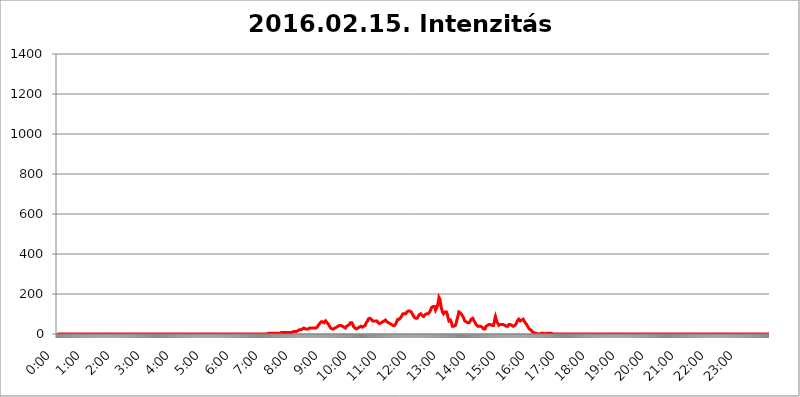
| Category | 2016.02.15. Intenzitás [W/m^2] |
|---|---|
| 0.0 | 0 |
| 0.0006944444444444445 | 0 |
| 0.001388888888888889 | 0 |
| 0.0020833333333333333 | 0 |
| 0.002777777777777778 | 0 |
| 0.003472222222222222 | 0 |
| 0.004166666666666667 | 0 |
| 0.004861111111111111 | 0 |
| 0.005555555555555556 | 0 |
| 0.0062499999999999995 | 0 |
| 0.006944444444444444 | 0 |
| 0.007638888888888889 | 0 |
| 0.008333333333333333 | 0 |
| 0.009027777777777779 | 0 |
| 0.009722222222222222 | 0 |
| 0.010416666666666666 | 0 |
| 0.011111111111111112 | 0 |
| 0.011805555555555555 | 0 |
| 0.012499999999999999 | 0 |
| 0.013194444444444444 | 0 |
| 0.013888888888888888 | 0 |
| 0.014583333333333332 | 0 |
| 0.015277777777777777 | 0 |
| 0.015972222222222224 | 0 |
| 0.016666666666666666 | 0 |
| 0.017361111111111112 | 0 |
| 0.018055555555555557 | 0 |
| 0.01875 | 0 |
| 0.019444444444444445 | 0 |
| 0.02013888888888889 | 0 |
| 0.020833333333333332 | 0 |
| 0.02152777777777778 | 0 |
| 0.022222222222222223 | 0 |
| 0.02291666666666667 | 0 |
| 0.02361111111111111 | 0 |
| 0.024305555555555556 | 0 |
| 0.024999999999999998 | 0 |
| 0.025694444444444447 | 0 |
| 0.02638888888888889 | 0 |
| 0.027083333333333334 | 0 |
| 0.027777777777777776 | 0 |
| 0.02847222222222222 | 0 |
| 0.029166666666666664 | 0 |
| 0.029861111111111113 | 0 |
| 0.030555555555555555 | 0 |
| 0.03125 | 0 |
| 0.03194444444444445 | 0 |
| 0.03263888888888889 | 0 |
| 0.03333333333333333 | 0 |
| 0.034027777777777775 | 0 |
| 0.034722222222222224 | 0 |
| 0.035416666666666666 | 0 |
| 0.036111111111111115 | 0 |
| 0.03680555555555556 | 0 |
| 0.0375 | 0 |
| 0.03819444444444444 | 0 |
| 0.03888888888888889 | 0 |
| 0.03958333333333333 | 0 |
| 0.04027777777777778 | 0 |
| 0.04097222222222222 | 0 |
| 0.041666666666666664 | 0 |
| 0.042361111111111106 | 0 |
| 0.04305555555555556 | 0 |
| 0.043750000000000004 | 0 |
| 0.044444444444444446 | 0 |
| 0.04513888888888889 | 0 |
| 0.04583333333333334 | 0 |
| 0.04652777777777778 | 0 |
| 0.04722222222222222 | 0 |
| 0.04791666666666666 | 0 |
| 0.04861111111111111 | 0 |
| 0.049305555555555554 | 0 |
| 0.049999999999999996 | 0 |
| 0.05069444444444445 | 0 |
| 0.051388888888888894 | 0 |
| 0.052083333333333336 | 0 |
| 0.05277777777777778 | 0 |
| 0.05347222222222222 | 0 |
| 0.05416666666666667 | 0 |
| 0.05486111111111111 | 0 |
| 0.05555555555555555 | 0 |
| 0.05625 | 0 |
| 0.05694444444444444 | 0 |
| 0.057638888888888885 | 0 |
| 0.05833333333333333 | 0 |
| 0.05902777777777778 | 0 |
| 0.059722222222222225 | 0 |
| 0.06041666666666667 | 0 |
| 0.061111111111111116 | 0 |
| 0.06180555555555556 | 0 |
| 0.0625 | 0 |
| 0.06319444444444444 | 0 |
| 0.06388888888888888 | 0 |
| 0.06458333333333334 | 0 |
| 0.06527777777777778 | 0 |
| 0.06597222222222222 | 0 |
| 0.06666666666666667 | 0 |
| 0.06736111111111111 | 0 |
| 0.06805555555555555 | 0 |
| 0.06874999999999999 | 0 |
| 0.06944444444444443 | 0 |
| 0.07013888888888889 | 0 |
| 0.07083333333333333 | 0 |
| 0.07152777777777779 | 0 |
| 0.07222222222222223 | 0 |
| 0.07291666666666667 | 0 |
| 0.07361111111111111 | 0 |
| 0.07430555555555556 | 0 |
| 0.075 | 0 |
| 0.07569444444444444 | 0 |
| 0.0763888888888889 | 0 |
| 0.07708333333333334 | 0 |
| 0.07777777777777778 | 0 |
| 0.07847222222222222 | 0 |
| 0.07916666666666666 | 0 |
| 0.0798611111111111 | 0 |
| 0.08055555555555556 | 0 |
| 0.08125 | 0 |
| 0.08194444444444444 | 0 |
| 0.08263888888888889 | 0 |
| 0.08333333333333333 | 0 |
| 0.08402777777777777 | 0 |
| 0.08472222222222221 | 0 |
| 0.08541666666666665 | 0 |
| 0.08611111111111112 | 0 |
| 0.08680555555555557 | 0 |
| 0.08750000000000001 | 0 |
| 0.08819444444444445 | 0 |
| 0.08888888888888889 | 0 |
| 0.08958333333333333 | 0 |
| 0.09027777777777778 | 0 |
| 0.09097222222222222 | 0 |
| 0.09166666666666667 | 0 |
| 0.09236111111111112 | 0 |
| 0.09305555555555556 | 0 |
| 0.09375 | 0 |
| 0.09444444444444444 | 0 |
| 0.09513888888888888 | 0 |
| 0.09583333333333333 | 0 |
| 0.09652777777777777 | 0 |
| 0.09722222222222222 | 0 |
| 0.09791666666666667 | 0 |
| 0.09861111111111111 | 0 |
| 0.09930555555555555 | 0 |
| 0.09999999999999999 | 0 |
| 0.10069444444444443 | 0 |
| 0.1013888888888889 | 0 |
| 0.10208333333333335 | 0 |
| 0.10277777777777779 | 0 |
| 0.10347222222222223 | 0 |
| 0.10416666666666667 | 0 |
| 0.10486111111111111 | 0 |
| 0.10555555555555556 | 0 |
| 0.10625 | 0 |
| 0.10694444444444444 | 0 |
| 0.1076388888888889 | 0 |
| 0.10833333333333334 | 0 |
| 0.10902777777777778 | 0 |
| 0.10972222222222222 | 0 |
| 0.1111111111111111 | 0 |
| 0.11180555555555556 | 0 |
| 0.11180555555555556 | 0 |
| 0.1125 | 0 |
| 0.11319444444444444 | 0 |
| 0.11388888888888889 | 0 |
| 0.11458333333333333 | 0 |
| 0.11527777777777777 | 0 |
| 0.11597222222222221 | 0 |
| 0.11666666666666665 | 0 |
| 0.1173611111111111 | 0 |
| 0.11805555555555557 | 0 |
| 0.11944444444444445 | 0 |
| 0.12013888888888889 | 0 |
| 0.12083333333333333 | 0 |
| 0.12152777777777778 | 0 |
| 0.12222222222222223 | 0 |
| 0.12291666666666667 | 0 |
| 0.12291666666666667 | 0 |
| 0.12361111111111112 | 0 |
| 0.12430555555555556 | 0 |
| 0.125 | 0 |
| 0.12569444444444444 | 0 |
| 0.12638888888888888 | 0 |
| 0.12708333333333333 | 0 |
| 0.16875 | 0 |
| 0.12847222222222224 | 0 |
| 0.12916666666666668 | 0 |
| 0.12986111111111112 | 0 |
| 0.13055555555555556 | 0 |
| 0.13125 | 0 |
| 0.13194444444444445 | 0 |
| 0.1326388888888889 | 0 |
| 0.13333333333333333 | 0 |
| 0.13402777777777777 | 0 |
| 0.13402777777777777 | 0 |
| 0.13472222222222222 | 0 |
| 0.13541666666666666 | 0 |
| 0.1361111111111111 | 0 |
| 0.13749999999999998 | 0 |
| 0.13819444444444443 | 0 |
| 0.1388888888888889 | 0 |
| 0.13958333333333334 | 0 |
| 0.14027777777777778 | 0 |
| 0.14097222222222222 | 0 |
| 0.14166666666666666 | 0 |
| 0.1423611111111111 | 0 |
| 0.14305555555555557 | 0 |
| 0.14375000000000002 | 0 |
| 0.14444444444444446 | 0 |
| 0.1451388888888889 | 0 |
| 0.1451388888888889 | 0 |
| 0.14652777777777778 | 0 |
| 0.14722222222222223 | 0 |
| 0.14791666666666667 | 0 |
| 0.1486111111111111 | 0 |
| 0.14930555555555555 | 0 |
| 0.15 | 0 |
| 0.15069444444444444 | 0 |
| 0.15138888888888888 | 0 |
| 0.15208333333333332 | 0 |
| 0.15277777777777776 | 0 |
| 0.15347222222222223 | 0 |
| 0.15416666666666667 | 0 |
| 0.15486111111111112 | 0 |
| 0.15555555555555556 | 0 |
| 0.15625 | 0 |
| 0.15694444444444444 | 0 |
| 0.15763888888888888 | 0 |
| 0.15833333333333333 | 0 |
| 0.15902777777777777 | 0 |
| 0.15972222222222224 | 0 |
| 0.16041666666666668 | 0 |
| 0.16111111111111112 | 0 |
| 0.16180555555555556 | 0 |
| 0.1625 | 0 |
| 0.16319444444444445 | 0 |
| 0.1638888888888889 | 0 |
| 0.16458333333333333 | 0 |
| 0.16527777777777777 | 0 |
| 0.16597222222222222 | 0 |
| 0.16666666666666666 | 0 |
| 0.1673611111111111 | 0 |
| 0.16805555555555554 | 0 |
| 0.16874999999999998 | 0 |
| 0.16944444444444443 | 0 |
| 0.17013888888888887 | 0 |
| 0.1708333333333333 | 0 |
| 0.17152777777777775 | 0 |
| 0.17222222222222225 | 0 |
| 0.1729166666666667 | 0 |
| 0.17361111111111113 | 0 |
| 0.17430555555555557 | 0 |
| 0.17500000000000002 | 0 |
| 0.17569444444444446 | 0 |
| 0.1763888888888889 | 0 |
| 0.17708333333333334 | 0 |
| 0.17777777777777778 | 0 |
| 0.17847222222222223 | 0 |
| 0.17916666666666667 | 0 |
| 0.1798611111111111 | 0 |
| 0.18055555555555555 | 0 |
| 0.18125 | 0 |
| 0.18194444444444444 | 0 |
| 0.1826388888888889 | 0 |
| 0.18333333333333335 | 0 |
| 0.1840277777777778 | 0 |
| 0.18472222222222223 | 0 |
| 0.18541666666666667 | 0 |
| 0.18611111111111112 | 0 |
| 0.18680555555555556 | 0 |
| 0.1875 | 0 |
| 0.18819444444444444 | 0 |
| 0.18888888888888888 | 0 |
| 0.18958333333333333 | 0 |
| 0.19027777777777777 | 0 |
| 0.1909722222222222 | 0 |
| 0.19166666666666665 | 0 |
| 0.19236111111111112 | 0 |
| 0.19305555555555554 | 0 |
| 0.19375 | 0 |
| 0.19444444444444445 | 0 |
| 0.1951388888888889 | 0 |
| 0.19583333333333333 | 0 |
| 0.19652777777777777 | 0 |
| 0.19722222222222222 | 0 |
| 0.19791666666666666 | 0 |
| 0.1986111111111111 | 0 |
| 0.19930555555555554 | 0 |
| 0.19999999999999998 | 0 |
| 0.20069444444444443 | 0 |
| 0.20138888888888887 | 0 |
| 0.2020833333333333 | 0 |
| 0.2027777777777778 | 0 |
| 0.2034722222222222 | 0 |
| 0.2041666666666667 | 0 |
| 0.20486111111111113 | 0 |
| 0.20555555555555557 | 0 |
| 0.20625000000000002 | 0 |
| 0.20694444444444446 | 0 |
| 0.2076388888888889 | 0 |
| 0.20833333333333334 | 0 |
| 0.20902777777777778 | 0 |
| 0.20972222222222223 | 0 |
| 0.21041666666666667 | 0 |
| 0.2111111111111111 | 0 |
| 0.21180555555555555 | 0 |
| 0.2125 | 0 |
| 0.21319444444444444 | 0 |
| 0.2138888888888889 | 0 |
| 0.21458333333333335 | 0 |
| 0.2152777777777778 | 0 |
| 0.21597222222222223 | 0 |
| 0.21666666666666667 | 0 |
| 0.21736111111111112 | 0 |
| 0.21805555555555556 | 0 |
| 0.21875 | 0 |
| 0.21944444444444444 | 0 |
| 0.22013888888888888 | 0 |
| 0.22083333333333333 | 0 |
| 0.22152777777777777 | 0 |
| 0.2222222222222222 | 0 |
| 0.22291666666666665 | 0 |
| 0.2236111111111111 | 0 |
| 0.22430555555555556 | 0 |
| 0.225 | 0 |
| 0.22569444444444445 | 0 |
| 0.2263888888888889 | 0 |
| 0.22708333333333333 | 0 |
| 0.22777777777777777 | 0 |
| 0.22847222222222222 | 0 |
| 0.22916666666666666 | 0 |
| 0.2298611111111111 | 0 |
| 0.23055555555555554 | 0 |
| 0.23124999999999998 | 0 |
| 0.23194444444444443 | 0 |
| 0.23263888888888887 | 0 |
| 0.2333333333333333 | 0 |
| 0.2340277777777778 | 0 |
| 0.2347222222222222 | 0 |
| 0.2354166666666667 | 0 |
| 0.23611111111111113 | 0 |
| 0.23680555555555557 | 0 |
| 0.23750000000000002 | 0 |
| 0.23819444444444446 | 0 |
| 0.2388888888888889 | 0 |
| 0.23958333333333334 | 0 |
| 0.24027777777777778 | 0 |
| 0.24097222222222223 | 0 |
| 0.24166666666666667 | 0 |
| 0.2423611111111111 | 0 |
| 0.24305555555555555 | 0 |
| 0.24375 | 0 |
| 0.24444444444444446 | 0 |
| 0.24513888888888888 | 0 |
| 0.24583333333333335 | 0 |
| 0.2465277777777778 | 0 |
| 0.24722222222222223 | 0 |
| 0.24791666666666667 | 0 |
| 0.24861111111111112 | 0 |
| 0.24930555555555556 | 0 |
| 0.25 | 0 |
| 0.25069444444444444 | 0 |
| 0.2513888888888889 | 0 |
| 0.2520833333333333 | 0 |
| 0.25277777777777777 | 0 |
| 0.2534722222222222 | 0 |
| 0.25416666666666665 | 0 |
| 0.2548611111111111 | 0 |
| 0.2555555555555556 | 0 |
| 0.25625000000000003 | 0 |
| 0.2569444444444445 | 0 |
| 0.2576388888888889 | 0 |
| 0.25833333333333336 | 0 |
| 0.2590277777777778 | 0 |
| 0.25972222222222224 | 0 |
| 0.2604166666666667 | 0 |
| 0.2611111111111111 | 0 |
| 0.26180555555555557 | 0 |
| 0.2625 | 0 |
| 0.26319444444444445 | 0 |
| 0.2638888888888889 | 0 |
| 0.26458333333333334 | 0 |
| 0.2652777777777778 | 0 |
| 0.2659722222222222 | 0 |
| 0.26666666666666666 | 0 |
| 0.2673611111111111 | 0 |
| 0.26805555555555555 | 0 |
| 0.26875 | 0 |
| 0.26944444444444443 | 0 |
| 0.2701388888888889 | 0 |
| 0.2708333333333333 | 0 |
| 0.27152777777777776 | 0 |
| 0.2722222222222222 | 0 |
| 0.27291666666666664 | 0 |
| 0.2736111111111111 | 0 |
| 0.2743055555555555 | 0 |
| 0.27499999999999997 | 0 |
| 0.27569444444444446 | 0 |
| 0.27638888888888885 | 0 |
| 0.27708333333333335 | 0 |
| 0.2777777777777778 | 0 |
| 0.27847222222222223 | 0 |
| 0.2791666666666667 | 0 |
| 0.2798611111111111 | 0 |
| 0.28055555555555556 | 0 |
| 0.28125 | 0 |
| 0.28194444444444444 | 0 |
| 0.2826388888888889 | 0 |
| 0.2833333333333333 | 0 |
| 0.28402777777777777 | 0 |
| 0.2847222222222222 | 0 |
| 0.28541666666666665 | 0 |
| 0.28611111111111115 | 0 |
| 0.28680555555555554 | 0 |
| 0.28750000000000003 | 0 |
| 0.2881944444444445 | 0 |
| 0.2888888888888889 | 0 |
| 0.28958333333333336 | 0 |
| 0.2902777777777778 | 0 |
| 0.29097222222222224 | 0 |
| 0.2916666666666667 | 0 |
| 0.2923611111111111 | 0 |
| 0.29305555555555557 | 0 |
| 0.29375 | 0 |
| 0.29444444444444445 | 3.525 |
| 0.2951388888888889 | 3.525 |
| 0.29583333333333334 | 3.525 |
| 0.2965277777777778 | 3.525 |
| 0.2972222222222222 | 3.525 |
| 0.29791666666666666 | 3.525 |
| 0.2986111111111111 | 3.525 |
| 0.29930555555555555 | 3.525 |
| 0.3 | 3.525 |
| 0.30069444444444443 | 3.525 |
| 0.3013888888888889 | 3.525 |
| 0.3020833333333333 | 3.525 |
| 0.30277777777777776 | 3.525 |
| 0.3034722222222222 | 3.525 |
| 0.30416666666666664 | 3.525 |
| 0.3048611111111111 | 3.525 |
| 0.3055555555555555 | 3.525 |
| 0.30624999999999997 | 3.525 |
| 0.3069444444444444 | 3.525 |
| 0.3076388888888889 | 3.525 |
| 0.30833333333333335 | 3.525 |
| 0.3090277777777778 | 3.525 |
| 0.30972222222222223 | 3.525 |
| 0.3104166666666667 | 3.525 |
| 0.3111111111111111 | 3.525 |
| 0.31180555555555556 | 3.525 |
| 0.3125 | 3.525 |
| 0.31319444444444444 | 7.887 |
| 0.3138888888888889 | 7.887 |
| 0.3145833333333333 | 7.887 |
| 0.31527777777777777 | 7.887 |
| 0.3159722222222222 | 7.887 |
| 0.31666666666666665 | 7.887 |
| 0.31736111111111115 | 7.887 |
| 0.31805555555555554 | 7.887 |
| 0.31875000000000003 | 7.887 |
| 0.3194444444444445 | 7.887 |
| 0.3201388888888889 | 7.887 |
| 0.32083333333333336 | 7.887 |
| 0.3215277777777778 | 7.887 |
| 0.32222222222222224 | 7.887 |
| 0.3229166666666667 | 7.887 |
| 0.3236111111111111 | 7.887 |
| 0.32430555555555557 | 7.887 |
| 0.325 | 7.887 |
| 0.32569444444444445 | 7.887 |
| 0.3263888888888889 | 7.887 |
| 0.32708333333333334 | 7.887 |
| 0.3277777777777778 | 7.887 |
| 0.3284722222222222 | 7.887 |
| 0.32916666666666666 | 7.887 |
| 0.3298611111111111 | 7.887 |
| 0.33055555555555555 | 7.887 |
| 0.33125 | 12.257 |
| 0.33194444444444443 | 12.257 |
| 0.3326388888888889 | 12.257 |
| 0.3333333333333333 | 12.257 |
| 0.3340277777777778 | 12.257 |
| 0.3347222222222222 | 12.257 |
| 0.3354166666666667 | 12.257 |
| 0.3361111111111111 | 12.257 |
| 0.3368055555555556 | 16.636 |
| 0.33749999999999997 | 16.636 |
| 0.33819444444444446 | 16.636 |
| 0.33888888888888885 | 16.636 |
| 0.33958333333333335 | 21.024 |
| 0.34027777777777773 | 21.024 |
| 0.34097222222222223 | 21.024 |
| 0.3416666666666666 | 21.024 |
| 0.3423611111111111 | 25.419 |
| 0.3430555555555555 | 25.419 |
| 0.34375 | 25.419 |
| 0.3444444444444445 | 29.823 |
| 0.3451388888888889 | 25.419 |
| 0.3458333333333334 | 29.823 |
| 0.34652777777777777 | 29.823 |
| 0.34722222222222227 | 29.823 |
| 0.34791666666666665 | 25.419 |
| 0.34861111111111115 | 25.419 |
| 0.34930555555555554 | 25.419 |
| 0.35000000000000003 | 25.419 |
| 0.3506944444444444 | 25.419 |
| 0.3513888888888889 | 25.419 |
| 0.3520833333333333 | 25.419 |
| 0.3527777777777778 | 25.419 |
| 0.3534722222222222 | 29.823 |
| 0.3541666666666667 | 29.823 |
| 0.3548611111111111 | 29.823 |
| 0.35555555555555557 | 29.823 |
| 0.35625 | 29.823 |
| 0.35694444444444445 | 29.823 |
| 0.3576388888888889 | 29.823 |
| 0.35833333333333334 | 29.823 |
| 0.3590277777777778 | 29.823 |
| 0.3597222222222222 | 29.823 |
| 0.36041666666666666 | 29.823 |
| 0.3611111111111111 | 29.823 |
| 0.36180555555555555 | 29.823 |
| 0.3625 | 29.823 |
| 0.36319444444444443 | 29.823 |
| 0.3638888888888889 | 34.234 |
| 0.3645833333333333 | 34.234 |
| 0.3652777777777778 | 38.653 |
| 0.3659722222222222 | 43.079 |
| 0.3666666666666667 | 47.511 |
| 0.3673611111111111 | 47.511 |
| 0.3680555555555556 | 51.951 |
| 0.36874999999999997 | 56.398 |
| 0.36944444444444446 | 56.398 |
| 0.37013888888888885 | 60.85 |
| 0.37083333333333335 | 60.85 |
| 0.37152777777777773 | 65.31 |
| 0.37222222222222223 | 60.85 |
| 0.3729166666666666 | 60.85 |
| 0.3736111111111111 | 56.398 |
| 0.3743055555555555 | 56.398 |
| 0.375 | 56.398 |
| 0.3756944444444445 | 60.85 |
| 0.3763888888888889 | 65.31 |
| 0.3770833333333334 | 60.85 |
| 0.37777777777777777 | 60.85 |
| 0.37847222222222227 | 56.398 |
| 0.37916666666666665 | 56.398 |
| 0.37986111111111115 | 51.951 |
| 0.38055555555555554 | 47.511 |
| 0.38125000000000003 | 43.079 |
| 0.3819444444444444 | 38.653 |
| 0.3826388888888889 | 34.234 |
| 0.3833333333333333 | 29.823 |
| 0.3840277777777778 | 29.823 |
| 0.3847222222222222 | 25.419 |
| 0.3854166666666667 | 25.419 |
| 0.3861111111111111 | 25.419 |
| 0.38680555555555557 | 29.823 |
| 0.3875 | 25.419 |
| 0.38819444444444445 | 29.823 |
| 0.3888888888888889 | 29.823 |
| 0.38958333333333334 | 29.823 |
| 0.3902777777777778 | 34.234 |
| 0.3909722222222222 | 34.234 |
| 0.39166666666666666 | 34.234 |
| 0.3923611111111111 | 34.234 |
| 0.39305555555555555 | 34.234 |
| 0.39375 | 38.653 |
| 0.39444444444444443 | 38.653 |
| 0.3951388888888889 | 43.079 |
| 0.3958333333333333 | 43.079 |
| 0.3965277777777778 | 43.079 |
| 0.3972222222222222 | 43.079 |
| 0.3979166666666667 | 43.079 |
| 0.3986111111111111 | 47.511 |
| 0.3993055555555556 | 43.079 |
| 0.39999999999999997 | 38.653 |
| 0.40069444444444446 | 38.653 |
| 0.40138888888888885 | 34.234 |
| 0.40208333333333335 | 34.234 |
| 0.40277777777777773 | 29.823 |
| 0.40347222222222223 | 29.823 |
| 0.4041666666666666 | 29.823 |
| 0.4048611111111111 | 34.234 |
| 0.4055555555555555 | 38.653 |
| 0.40625 | 38.653 |
| 0.4069444444444445 | 38.653 |
| 0.4076388888888889 | 43.079 |
| 0.4083333333333334 | 47.511 |
| 0.40902777777777777 | 47.511 |
| 0.40972222222222227 | 47.511 |
| 0.41041666666666665 | 51.951 |
| 0.41111111111111115 | 56.398 |
| 0.41180555555555554 | 56.398 |
| 0.41250000000000003 | 56.398 |
| 0.4131944444444444 | 56.398 |
| 0.4138888888888889 | 51.951 |
| 0.4145833333333333 | 47.511 |
| 0.4152777777777778 | 38.653 |
| 0.4159722222222222 | 34.234 |
| 0.4166666666666667 | 34.234 |
| 0.4173611111111111 | 29.823 |
| 0.41805555555555557 | 29.823 |
| 0.41875 | 29.823 |
| 0.41944444444444445 | 25.419 |
| 0.4201388888888889 | 25.419 |
| 0.42083333333333334 | 25.419 |
| 0.4215277777777778 | 29.823 |
| 0.4222222222222222 | 29.823 |
| 0.42291666666666666 | 29.823 |
| 0.4236111111111111 | 34.234 |
| 0.42430555555555555 | 34.234 |
| 0.425 | 38.653 |
| 0.42569444444444443 | 38.653 |
| 0.4263888888888889 | 38.653 |
| 0.4270833333333333 | 34.234 |
| 0.4277777777777778 | 34.234 |
| 0.4284722222222222 | 34.234 |
| 0.4291666666666667 | 34.234 |
| 0.4298611111111111 | 38.653 |
| 0.4305555555555556 | 38.653 |
| 0.43124999999999997 | 38.653 |
| 0.43194444444444446 | 43.079 |
| 0.43263888888888885 | 47.511 |
| 0.43333333333333335 | 56.398 |
| 0.43402777777777773 | 60.85 |
| 0.43472222222222223 | 60.85 |
| 0.4354166666666666 | 65.31 |
| 0.4361111111111111 | 74.246 |
| 0.4368055555555555 | 78.722 |
| 0.4375 | 78.722 |
| 0.4381944444444445 | 78.722 |
| 0.4388888888888889 | 74.246 |
| 0.4395833333333334 | 74.246 |
| 0.44027777777777777 | 74.246 |
| 0.44097222222222227 | 74.246 |
| 0.44166666666666665 | 69.775 |
| 0.44236111111111115 | 65.31 |
| 0.44305555555555554 | 65.31 |
| 0.44375000000000003 | 60.85 |
| 0.4444444444444444 | 65.31 |
| 0.4451388888888889 | 65.31 |
| 0.4458333333333333 | 65.31 |
| 0.4465277777777778 | 65.31 |
| 0.4472222222222222 | 65.31 |
| 0.4479166666666667 | 65.31 |
| 0.4486111111111111 | 65.31 |
| 0.44930555555555557 | 60.85 |
| 0.45 | 56.398 |
| 0.45069444444444445 | 56.398 |
| 0.4513888888888889 | 56.398 |
| 0.45208333333333334 | 51.951 |
| 0.4527777777777778 | 56.398 |
| 0.4534722222222222 | 56.398 |
| 0.45416666666666666 | 56.398 |
| 0.4548611111111111 | 56.398 |
| 0.45555555555555555 | 56.398 |
| 0.45625 | 60.85 |
| 0.45694444444444443 | 60.85 |
| 0.4576388888888889 | 65.31 |
| 0.4583333333333333 | 65.31 |
| 0.4590277777777778 | 69.775 |
| 0.4597222222222222 | 69.775 |
| 0.4604166666666667 | 69.775 |
| 0.4611111111111111 | 65.31 |
| 0.4618055555555556 | 65.31 |
| 0.46249999999999997 | 60.85 |
| 0.46319444444444446 | 56.398 |
| 0.46388888888888885 | 56.398 |
| 0.46458333333333335 | 56.398 |
| 0.46527777777777773 | 51.951 |
| 0.46597222222222223 | 51.951 |
| 0.4666666666666666 | 51.951 |
| 0.4673611111111111 | 51.951 |
| 0.4680555555555555 | 51.951 |
| 0.46875 | 47.511 |
| 0.4694444444444445 | 47.511 |
| 0.4701388888888889 | 47.511 |
| 0.4708333333333334 | 43.079 |
| 0.47152777777777777 | 43.079 |
| 0.47222222222222227 | 43.079 |
| 0.47291666666666665 | 43.079 |
| 0.47361111111111115 | 47.511 |
| 0.47430555555555554 | 47.511 |
| 0.47500000000000003 | 51.951 |
| 0.4756944444444444 | 56.398 |
| 0.4763888888888889 | 65.31 |
| 0.4770833333333333 | 69.775 |
| 0.4777777777777778 | 74.246 |
| 0.4784722222222222 | 74.246 |
| 0.4791666666666667 | 74.246 |
| 0.4798611111111111 | 74.246 |
| 0.48055555555555557 | 74.246 |
| 0.48125 | 78.722 |
| 0.48194444444444445 | 83.205 |
| 0.4826388888888889 | 87.692 |
| 0.48333333333333334 | 92.184 |
| 0.4840277777777778 | 96.682 |
| 0.4847222222222222 | 101.184 |
| 0.48541666666666666 | 101.184 |
| 0.4861111111111111 | 101.184 |
| 0.48680555555555555 | 101.184 |
| 0.4875 | 101.184 |
| 0.48819444444444443 | 101.184 |
| 0.4888888888888889 | 101.184 |
| 0.4895833333333333 | 105.69 |
| 0.4902777777777778 | 110.201 |
| 0.4909722222222222 | 110.201 |
| 0.4916666666666667 | 114.716 |
| 0.4923611111111111 | 114.716 |
| 0.4930555555555556 | 119.235 |
| 0.49374999999999997 | 114.716 |
| 0.49444444444444446 | 114.716 |
| 0.49513888888888885 | 114.716 |
| 0.49583333333333335 | 110.201 |
| 0.49652777777777773 | 110.201 |
| 0.49722222222222223 | 105.69 |
| 0.4979166666666666 | 101.184 |
| 0.4986111111111111 | 101.184 |
| 0.4993055555555555 | 92.184 |
| 0.5 | 87.692 |
| 0.5006944444444444 | 83.205 |
| 0.5013888888888889 | 83.205 |
| 0.5020833333333333 | 78.722 |
| 0.5027777777777778 | 78.722 |
| 0.5034722222222222 | 74.246 |
| 0.5041666666666667 | 78.722 |
| 0.5048611111111111 | 78.722 |
| 0.5055555555555555 | 83.205 |
| 0.50625 | 87.692 |
| 0.5069444444444444 | 92.184 |
| 0.5076388888888889 | 96.682 |
| 0.5083333333333333 | 96.682 |
| 0.5090277777777777 | 101.184 |
| 0.5097222222222222 | 101.184 |
| 0.5104166666666666 | 96.682 |
| 0.5111111111111112 | 96.682 |
| 0.5118055555555555 | 92.184 |
| 0.5125000000000001 | 87.692 |
| 0.5131944444444444 | 87.692 |
| 0.513888888888889 | 87.692 |
| 0.5145833333333333 | 87.692 |
| 0.5152777777777778 | 92.184 |
| 0.5159722222222222 | 96.682 |
| 0.5166666666666667 | 96.682 |
| 0.517361111111111 | 101.184 |
| 0.5180555555555556 | 101.184 |
| 0.5187499999999999 | 101.184 |
| 0.5194444444444445 | 101.184 |
| 0.5201388888888888 | 101.184 |
| 0.5208333333333334 | 101.184 |
| 0.5215277777777778 | 105.69 |
| 0.5222222222222223 | 110.201 |
| 0.5229166666666667 | 114.716 |
| 0.5236111111111111 | 119.235 |
| 0.5243055555555556 | 119.235 |
| 0.525 | 132.814 |
| 0.5256944444444445 | 137.347 |
| 0.5263888888888889 | 137.347 |
| 0.5270833333333333 | 137.347 |
| 0.5277777777777778 | 137.347 |
| 0.5284722222222222 | 132.814 |
| 0.5291666666666667 | 137.347 |
| 0.5298611111111111 | 128.284 |
| 0.5305555555555556 | 119.235 |
| 0.53125 | 123.758 |
| 0.5319444444444444 | 128.284 |
| 0.5326388888888889 | 132.814 |
| 0.5333333333333333 | 141.884 |
| 0.5340277777777778 | 155.509 |
| 0.5347222222222222 | 164.605 |
| 0.5354166666666667 | 182.82 |
| 0.5361111111111111 | 187.378 |
| 0.5368055555555555 | 173.709 |
| 0.5375 | 155.509 |
| 0.5381944444444444 | 137.347 |
| 0.5388888888888889 | 128.284 |
| 0.5395833333333333 | 119.235 |
| 0.5402777777777777 | 110.201 |
| 0.5409722222222222 | 110.201 |
| 0.5416666666666666 | 101.184 |
| 0.5423611111111112 | 101.184 |
| 0.5430555555555555 | 105.69 |
| 0.5437500000000001 | 110.201 |
| 0.5444444444444444 | 114.716 |
| 0.545138888888889 | 114.716 |
| 0.5458333333333333 | 110.201 |
| 0.5465277777777778 | 110.201 |
| 0.5472222222222222 | 96.682 |
| 0.5479166666666667 | 83.205 |
| 0.548611111111111 | 74.246 |
| 0.5493055555555556 | 65.31 |
| 0.5499999999999999 | 65.31 |
| 0.5506944444444445 | 65.31 |
| 0.5513888888888888 | 69.775 |
| 0.5520833333333334 | 65.31 |
| 0.5527777777777778 | 56.398 |
| 0.5534722222222223 | 47.511 |
| 0.5541666666666667 | 38.653 |
| 0.5548611111111111 | 38.653 |
| 0.5555555555555556 | 38.653 |
| 0.55625 | 38.653 |
| 0.5569444444444445 | 38.653 |
| 0.5576388888888889 | 38.653 |
| 0.5583333333333333 | 43.079 |
| 0.5590277777777778 | 47.511 |
| 0.5597222222222222 | 56.398 |
| 0.5604166666666667 | 69.775 |
| 0.5611111111111111 | 74.246 |
| 0.5618055555555556 | 87.692 |
| 0.5625 | 96.682 |
| 0.5631944444444444 | 110.201 |
| 0.5638888888888889 | 105.69 |
| 0.5645833333333333 | 105.69 |
| 0.5652777777777778 | 105.69 |
| 0.5659722222222222 | 101.184 |
| 0.5666666666666667 | 101.184 |
| 0.5673611111111111 | 96.682 |
| 0.5680555555555555 | 92.184 |
| 0.56875 | 87.692 |
| 0.5694444444444444 | 83.205 |
| 0.5701388888888889 | 78.722 |
| 0.5708333333333333 | 74.246 |
| 0.5715277777777777 | 65.31 |
| 0.5722222222222222 | 65.31 |
| 0.5729166666666666 | 65.31 |
| 0.5736111111111112 | 60.85 |
| 0.5743055555555555 | 60.85 |
| 0.5750000000000001 | 60.85 |
| 0.5756944444444444 | 56.398 |
| 0.576388888888889 | 56.398 |
| 0.5770833333333333 | 56.398 |
| 0.5777777777777778 | 56.398 |
| 0.5784722222222222 | 56.398 |
| 0.5791666666666667 | 65.31 |
| 0.579861111111111 | 65.31 |
| 0.5805555555555556 | 74.246 |
| 0.5812499999999999 | 74.246 |
| 0.5819444444444445 | 78.722 |
| 0.5826388888888888 | 78.722 |
| 0.5833333333333334 | 74.246 |
| 0.5840277777777778 | 69.775 |
| 0.5847222222222223 | 69.775 |
| 0.5854166666666667 | 65.31 |
| 0.5861111111111111 | 56.398 |
| 0.5868055555555556 | 51.951 |
| 0.5875 | 47.511 |
| 0.5881944444444445 | 43.079 |
| 0.5888888888888889 | 43.079 |
| 0.5895833333333333 | 38.653 |
| 0.5902777777777778 | 38.653 |
| 0.5909722222222222 | 38.653 |
| 0.5916666666666667 | 38.653 |
| 0.5923611111111111 | 38.653 |
| 0.5930555555555556 | 38.653 |
| 0.59375 | 38.653 |
| 0.5944444444444444 | 38.653 |
| 0.5951388888888889 | 38.653 |
| 0.5958333333333333 | 34.234 |
| 0.5965277777777778 | 29.823 |
| 0.5972222222222222 | 29.823 |
| 0.5979166666666667 | 25.419 |
| 0.5986111111111111 | 25.419 |
| 0.5993055555555555 | 25.419 |
| 0.6 | 25.419 |
| 0.6006944444444444 | 29.823 |
| 0.6013888888888889 | 38.653 |
| 0.6020833333333333 | 43.079 |
| 0.6027777777777777 | 43.079 |
| 0.6034722222222222 | 43.079 |
| 0.6041666666666666 | 43.079 |
| 0.6048611111111112 | 47.511 |
| 0.6055555555555555 | 47.511 |
| 0.6062500000000001 | 47.511 |
| 0.6069444444444444 | 47.511 |
| 0.607638888888889 | 47.511 |
| 0.6083333333333333 | 43.079 |
| 0.6090277777777778 | 43.079 |
| 0.6097222222222222 | 43.079 |
| 0.6104166666666667 | 43.079 |
| 0.611111111111111 | 38.653 |
| 0.6118055555555556 | 43.079 |
| 0.6124999999999999 | 51.951 |
| 0.6131944444444445 | 65.31 |
| 0.6138888888888888 | 78.722 |
| 0.6145833333333334 | 87.692 |
| 0.6152777777777778 | 83.205 |
| 0.6159722222222223 | 69.775 |
| 0.6166666666666667 | 60.85 |
| 0.6173611111111111 | 56.398 |
| 0.6180555555555556 | 51.951 |
| 0.61875 | 47.511 |
| 0.6194444444444445 | 43.079 |
| 0.6201388888888889 | 43.079 |
| 0.6208333333333333 | 43.079 |
| 0.6215277777777778 | 47.511 |
| 0.6222222222222222 | 47.511 |
| 0.6229166666666667 | 47.511 |
| 0.6236111111111111 | 47.511 |
| 0.6243055555555556 | 51.951 |
| 0.625 | 51.951 |
| 0.6256944444444444 | 47.511 |
| 0.6263888888888889 | 51.951 |
| 0.6270833333333333 | 47.511 |
| 0.6277777777777778 | 43.079 |
| 0.6284722222222222 | 43.079 |
| 0.6291666666666667 | 38.653 |
| 0.6298611111111111 | 38.653 |
| 0.6305555555555555 | 38.653 |
| 0.63125 | 38.653 |
| 0.6319444444444444 | 38.653 |
| 0.6326388888888889 | 43.079 |
| 0.6333333333333333 | 47.511 |
| 0.6340277777777777 | 47.511 |
| 0.6347222222222222 | 47.511 |
| 0.6354166666666666 | 47.511 |
| 0.6361111111111112 | 43.079 |
| 0.6368055555555555 | 43.079 |
| 0.6375000000000001 | 43.079 |
| 0.6381944444444444 | 43.079 |
| 0.638888888888889 | 38.653 |
| 0.6395833333333333 | 38.653 |
| 0.6402777777777778 | 38.653 |
| 0.6409722222222222 | 38.653 |
| 0.6416666666666667 | 43.079 |
| 0.642361111111111 | 47.511 |
| 0.6430555555555556 | 47.511 |
| 0.6437499999999999 | 51.951 |
| 0.6444444444444445 | 56.398 |
| 0.6451388888888888 | 65.31 |
| 0.6458333333333334 | 65.31 |
| 0.6465277777777778 | 69.775 |
| 0.6472222222222223 | 74.246 |
| 0.6479166666666667 | 69.775 |
| 0.6486111111111111 | 69.775 |
| 0.6493055555555556 | 65.31 |
| 0.65 | 65.31 |
| 0.6506944444444445 | 65.31 |
| 0.6513888888888889 | 69.775 |
| 0.6520833333333333 | 74.246 |
| 0.6527777777777778 | 74.246 |
| 0.6534722222222222 | 74.246 |
| 0.6541666666666667 | 69.775 |
| 0.6548611111111111 | 65.31 |
| 0.6555555555555556 | 60.85 |
| 0.65625 | 56.398 |
| 0.6569444444444444 | 56.398 |
| 0.6576388888888889 | 51.951 |
| 0.6583333333333333 | 47.511 |
| 0.6590277777777778 | 47.511 |
| 0.6597222222222222 | 43.079 |
| 0.6604166666666667 | 34.234 |
| 0.6611111111111111 | 29.823 |
| 0.6618055555555555 | 25.419 |
| 0.6625 | 21.024 |
| 0.6631944444444444 | 21.024 |
| 0.6638888888888889 | 21.024 |
| 0.6645833333333333 | 16.636 |
| 0.6652777777777777 | 16.636 |
| 0.6659722222222222 | 12.257 |
| 0.6666666666666666 | 12.257 |
| 0.6673611111111111 | 7.887 |
| 0.6680555555555556 | 7.887 |
| 0.6687500000000001 | 7.887 |
| 0.6694444444444444 | 3.525 |
| 0.6701388888888888 | 3.525 |
| 0.6708333333333334 | 3.525 |
| 0.6715277777777778 | 3.525 |
| 0.6722222222222222 | 3.525 |
| 0.6729166666666666 | 3.525 |
| 0.6736111111111112 | 0 |
| 0.6743055555555556 | 0 |
| 0.6749999999999999 | 0 |
| 0.6756944444444444 | 0 |
| 0.6763888888888889 | 0 |
| 0.6770833333333334 | 0 |
| 0.6777777777777777 | 0 |
| 0.6784722222222223 | 3.525 |
| 0.6791666666666667 | 3.525 |
| 0.6798611111111111 | 0 |
| 0.6805555555555555 | 3.525 |
| 0.68125 | 0 |
| 0.6819444444444445 | 3.525 |
| 0.6826388888888889 | 3.525 |
| 0.6833333333333332 | 3.525 |
| 0.6840277777777778 | 0 |
| 0.6847222222222222 | 0 |
| 0.6854166666666667 | 3.525 |
| 0.686111111111111 | 3.525 |
| 0.6868055555555556 | 3.525 |
| 0.6875 | 3.525 |
| 0.6881944444444444 | 3.525 |
| 0.688888888888889 | 3.525 |
| 0.6895833333333333 | 3.525 |
| 0.6902777777777778 | 3.525 |
| 0.6909722222222222 | 3.525 |
| 0.6916666666666668 | 3.525 |
| 0.6923611111111111 | 3.525 |
| 0.6930555555555555 | 3.525 |
| 0.69375 | 0 |
| 0.6944444444444445 | 0 |
| 0.6951388888888889 | 0 |
| 0.6958333333333333 | 0 |
| 0.6965277777777777 | 0 |
| 0.6972222222222223 | 0 |
| 0.6979166666666666 | 0 |
| 0.6986111111111111 | 0 |
| 0.6993055555555556 | 0 |
| 0.7000000000000001 | 0 |
| 0.7006944444444444 | 0 |
| 0.7013888888888888 | 0 |
| 0.7020833333333334 | 0 |
| 0.7027777777777778 | 0 |
| 0.7034722222222222 | 0 |
| 0.7041666666666666 | 0 |
| 0.7048611111111112 | 0 |
| 0.7055555555555556 | 0 |
| 0.7062499999999999 | 0 |
| 0.7069444444444444 | 0 |
| 0.7076388888888889 | 0 |
| 0.7083333333333334 | 0 |
| 0.7090277777777777 | 0 |
| 0.7097222222222223 | 0 |
| 0.7104166666666667 | 0 |
| 0.7111111111111111 | 0 |
| 0.7118055555555555 | 0 |
| 0.7125 | 0 |
| 0.7131944444444445 | 0 |
| 0.7138888888888889 | 0 |
| 0.7145833333333332 | 0 |
| 0.7152777777777778 | 0 |
| 0.7159722222222222 | 0 |
| 0.7166666666666667 | 0 |
| 0.717361111111111 | 0 |
| 0.7180555555555556 | 0 |
| 0.71875 | 0 |
| 0.7194444444444444 | 0 |
| 0.720138888888889 | 0 |
| 0.7208333333333333 | 0 |
| 0.7215277777777778 | 0 |
| 0.7222222222222222 | 0 |
| 0.7229166666666668 | 0 |
| 0.7236111111111111 | 0 |
| 0.7243055555555555 | 0 |
| 0.725 | 0 |
| 0.7256944444444445 | 0 |
| 0.7263888888888889 | 0 |
| 0.7270833333333333 | 0 |
| 0.7277777777777777 | 0 |
| 0.7284722222222223 | 0 |
| 0.7291666666666666 | 0 |
| 0.7298611111111111 | 0 |
| 0.7305555555555556 | 0 |
| 0.7312500000000001 | 0 |
| 0.7319444444444444 | 0 |
| 0.7326388888888888 | 0 |
| 0.7333333333333334 | 0 |
| 0.7340277777777778 | 0 |
| 0.7347222222222222 | 0 |
| 0.7354166666666666 | 0 |
| 0.7361111111111112 | 0 |
| 0.7368055555555556 | 0 |
| 0.7374999999999999 | 0 |
| 0.7381944444444444 | 0 |
| 0.7388888888888889 | 0 |
| 0.7395833333333334 | 0 |
| 0.7402777777777777 | 0 |
| 0.7409722222222223 | 0 |
| 0.7416666666666667 | 0 |
| 0.7423611111111111 | 0 |
| 0.7430555555555555 | 0 |
| 0.74375 | 0 |
| 0.7444444444444445 | 0 |
| 0.7451388888888889 | 0 |
| 0.7458333333333332 | 0 |
| 0.7465277777777778 | 0 |
| 0.7472222222222222 | 0 |
| 0.7479166666666667 | 0 |
| 0.748611111111111 | 0 |
| 0.7493055555555556 | 0 |
| 0.75 | 0 |
| 0.7506944444444444 | 0 |
| 0.751388888888889 | 0 |
| 0.7520833333333333 | 0 |
| 0.7527777777777778 | 0 |
| 0.7534722222222222 | 0 |
| 0.7541666666666668 | 0 |
| 0.7548611111111111 | 0 |
| 0.7555555555555555 | 0 |
| 0.75625 | 0 |
| 0.7569444444444445 | 0 |
| 0.7576388888888889 | 0 |
| 0.7583333333333333 | 0 |
| 0.7590277777777777 | 0 |
| 0.7597222222222223 | 0 |
| 0.7604166666666666 | 0 |
| 0.7611111111111111 | 0 |
| 0.7618055555555556 | 0 |
| 0.7625000000000001 | 0 |
| 0.7631944444444444 | 0 |
| 0.7638888888888888 | 0 |
| 0.7645833333333334 | 0 |
| 0.7652777777777778 | 0 |
| 0.7659722222222222 | 0 |
| 0.7666666666666666 | 0 |
| 0.7673611111111112 | 0 |
| 0.7680555555555556 | 0 |
| 0.7687499999999999 | 0 |
| 0.7694444444444444 | 0 |
| 0.7701388888888889 | 0 |
| 0.7708333333333334 | 0 |
| 0.7715277777777777 | 0 |
| 0.7722222222222223 | 0 |
| 0.7729166666666667 | 0 |
| 0.7736111111111111 | 0 |
| 0.7743055555555555 | 0 |
| 0.775 | 0 |
| 0.7756944444444445 | 0 |
| 0.7763888888888889 | 0 |
| 0.7770833333333332 | 0 |
| 0.7777777777777778 | 0 |
| 0.7784722222222222 | 0 |
| 0.7791666666666667 | 0 |
| 0.779861111111111 | 0 |
| 0.7805555555555556 | 0 |
| 0.78125 | 0 |
| 0.7819444444444444 | 0 |
| 0.782638888888889 | 0 |
| 0.7833333333333333 | 0 |
| 0.7840277777777778 | 0 |
| 0.7847222222222222 | 0 |
| 0.7854166666666668 | 0 |
| 0.7861111111111111 | 0 |
| 0.7868055555555555 | 0 |
| 0.7875 | 0 |
| 0.7881944444444445 | 0 |
| 0.7888888888888889 | 0 |
| 0.7895833333333333 | 0 |
| 0.7902777777777777 | 0 |
| 0.7909722222222223 | 0 |
| 0.7916666666666666 | 0 |
| 0.7923611111111111 | 0 |
| 0.7930555555555556 | 0 |
| 0.7937500000000001 | 0 |
| 0.7944444444444444 | 0 |
| 0.7951388888888888 | 0 |
| 0.7958333333333334 | 0 |
| 0.7965277777777778 | 0 |
| 0.7972222222222222 | 0 |
| 0.7979166666666666 | 0 |
| 0.7986111111111112 | 0 |
| 0.7993055555555556 | 0 |
| 0.7999999999999999 | 0 |
| 0.8006944444444444 | 0 |
| 0.8013888888888889 | 0 |
| 0.8020833333333334 | 0 |
| 0.8027777777777777 | 0 |
| 0.8034722222222223 | 0 |
| 0.8041666666666667 | 0 |
| 0.8048611111111111 | 0 |
| 0.8055555555555555 | 0 |
| 0.80625 | 0 |
| 0.8069444444444445 | 0 |
| 0.8076388888888889 | 0 |
| 0.8083333333333332 | 0 |
| 0.8090277777777778 | 0 |
| 0.8097222222222222 | 0 |
| 0.8104166666666667 | 0 |
| 0.811111111111111 | 0 |
| 0.8118055555555556 | 0 |
| 0.8125 | 0 |
| 0.8131944444444444 | 0 |
| 0.813888888888889 | 0 |
| 0.8145833333333333 | 0 |
| 0.8152777777777778 | 0 |
| 0.8159722222222222 | 0 |
| 0.8166666666666668 | 0 |
| 0.8173611111111111 | 0 |
| 0.8180555555555555 | 0 |
| 0.81875 | 0 |
| 0.8194444444444445 | 0 |
| 0.8201388888888889 | 0 |
| 0.8208333333333333 | 0 |
| 0.8215277777777777 | 0 |
| 0.8222222222222223 | 0 |
| 0.8229166666666666 | 0 |
| 0.8236111111111111 | 0 |
| 0.8243055555555556 | 0 |
| 0.8250000000000001 | 0 |
| 0.8256944444444444 | 0 |
| 0.8263888888888888 | 0 |
| 0.8270833333333334 | 0 |
| 0.8277777777777778 | 0 |
| 0.8284722222222222 | 0 |
| 0.8291666666666666 | 0 |
| 0.8298611111111112 | 0 |
| 0.8305555555555556 | 0 |
| 0.8312499999999999 | 0 |
| 0.8319444444444444 | 0 |
| 0.8326388888888889 | 0 |
| 0.8333333333333334 | 0 |
| 0.8340277777777777 | 0 |
| 0.8347222222222223 | 0 |
| 0.8354166666666667 | 0 |
| 0.8361111111111111 | 0 |
| 0.8368055555555555 | 0 |
| 0.8375 | 0 |
| 0.8381944444444445 | 0 |
| 0.8388888888888889 | 0 |
| 0.8395833333333332 | 0 |
| 0.8402777777777778 | 0 |
| 0.8409722222222222 | 0 |
| 0.8416666666666667 | 0 |
| 0.842361111111111 | 0 |
| 0.8430555555555556 | 0 |
| 0.84375 | 0 |
| 0.8444444444444444 | 0 |
| 0.845138888888889 | 0 |
| 0.8458333333333333 | 0 |
| 0.8465277777777778 | 0 |
| 0.8472222222222222 | 0 |
| 0.8479166666666668 | 0 |
| 0.8486111111111111 | 0 |
| 0.8493055555555555 | 0 |
| 0.85 | 0 |
| 0.8506944444444445 | 0 |
| 0.8513888888888889 | 0 |
| 0.8520833333333333 | 0 |
| 0.8527777777777777 | 0 |
| 0.8534722222222223 | 0 |
| 0.8541666666666666 | 0 |
| 0.8548611111111111 | 0 |
| 0.8555555555555556 | 0 |
| 0.8562500000000001 | 0 |
| 0.8569444444444444 | 0 |
| 0.8576388888888888 | 0 |
| 0.8583333333333334 | 0 |
| 0.8590277777777778 | 0 |
| 0.8597222222222222 | 0 |
| 0.8604166666666666 | 0 |
| 0.8611111111111112 | 0 |
| 0.8618055555555556 | 0 |
| 0.8624999999999999 | 0 |
| 0.8631944444444444 | 0 |
| 0.8638888888888889 | 0 |
| 0.8645833333333334 | 0 |
| 0.8652777777777777 | 0 |
| 0.8659722222222223 | 0 |
| 0.8666666666666667 | 0 |
| 0.8673611111111111 | 0 |
| 0.8680555555555555 | 0 |
| 0.86875 | 0 |
| 0.8694444444444445 | 0 |
| 0.8701388888888889 | 0 |
| 0.8708333333333332 | 0 |
| 0.8715277777777778 | 0 |
| 0.8722222222222222 | 0 |
| 0.8729166666666667 | 0 |
| 0.873611111111111 | 0 |
| 0.8743055555555556 | 0 |
| 0.875 | 0 |
| 0.8756944444444444 | 0 |
| 0.876388888888889 | 0 |
| 0.8770833333333333 | 0 |
| 0.8777777777777778 | 0 |
| 0.8784722222222222 | 0 |
| 0.8791666666666668 | 0 |
| 0.8798611111111111 | 0 |
| 0.8805555555555555 | 0 |
| 0.88125 | 0 |
| 0.8819444444444445 | 0 |
| 0.8826388888888889 | 0 |
| 0.8833333333333333 | 0 |
| 0.8840277777777777 | 0 |
| 0.8847222222222223 | 0 |
| 0.8854166666666666 | 0 |
| 0.8861111111111111 | 0 |
| 0.8868055555555556 | 0 |
| 0.8875000000000001 | 0 |
| 0.8881944444444444 | 0 |
| 0.8888888888888888 | 0 |
| 0.8895833333333334 | 0 |
| 0.8902777777777778 | 0 |
| 0.8909722222222222 | 0 |
| 0.8916666666666666 | 0 |
| 0.8923611111111112 | 0 |
| 0.8930555555555556 | 0 |
| 0.8937499999999999 | 0 |
| 0.8944444444444444 | 0 |
| 0.8951388888888889 | 0 |
| 0.8958333333333334 | 0 |
| 0.8965277777777777 | 0 |
| 0.8972222222222223 | 0 |
| 0.8979166666666667 | 0 |
| 0.8986111111111111 | 0 |
| 0.8993055555555555 | 0 |
| 0.9 | 0 |
| 0.9006944444444445 | 0 |
| 0.9013888888888889 | 0 |
| 0.9020833333333332 | 0 |
| 0.9027777777777778 | 0 |
| 0.9034722222222222 | 0 |
| 0.9041666666666667 | 0 |
| 0.904861111111111 | 0 |
| 0.9055555555555556 | 0 |
| 0.90625 | 0 |
| 0.9069444444444444 | 0 |
| 0.907638888888889 | 0 |
| 0.9083333333333333 | 0 |
| 0.9090277777777778 | 0 |
| 0.9097222222222222 | 0 |
| 0.9104166666666668 | 0 |
| 0.9111111111111111 | 0 |
| 0.9118055555555555 | 0 |
| 0.9125 | 0 |
| 0.9131944444444445 | 0 |
| 0.9138888888888889 | 0 |
| 0.9145833333333333 | 0 |
| 0.9152777777777777 | 0 |
| 0.9159722222222223 | 0 |
| 0.9166666666666666 | 0 |
| 0.9173611111111111 | 0 |
| 0.9180555555555556 | 0 |
| 0.9187500000000001 | 0 |
| 0.9194444444444444 | 0 |
| 0.9201388888888888 | 0 |
| 0.9208333333333334 | 0 |
| 0.9215277777777778 | 0 |
| 0.9222222222222222 | 0 |
| 0.9229166666666666 | 0 |
| 0.9236111111111112 | 0 |
| 0.9243055555555556 | 0 |
| 0.9249999999999999 | 0 |
| 0.9256944444444444 | 0 |
| 0.9263888888888889 | 0 |
| 0.9270833333333334 | 0 |
| 0.9277777777777777 | 0 |
| 0.9284722222222223 | 0 |
| 0.9291666666666667 | 0 |
| 0.9298611111111111 | 0 |
| 0.9305555555555555 | 0 |
| 0.93125 | 0 |
| 0.9319444444444445 | 0 |
| 0.9326388888888889 | 0 |
| 0.9333333333333332 | 0 |
| 0.9340277777777778 | 0 |
| 0.9347222222222222 | 0 |
| 0.9354166666666667 | 0 |
| 0.936111111111111 | 0 |
| 0.9368055555555556 | 0 |
| 0.9375 | 0 |
| 0.9381944444444444 | 0 |
| 0.938888888888889 | 0 |
| 0.9395833333333333 | 0 |
| 0.9402777777777778 | 0 |
| 0.9409722222222222 | 0 |
| 0.9416666666666668 | 0 |
| 0.9423611111111111 | 0 |
| 0.9430555555555555 | 0 |
| 0.94375 | 0 |
| 0.9444444444444445 | 0 |
| 0.9451388888888889 | 0 |
| 0.9458333333333333 | 0 |
| 0.9465277777777777 | 0 |
| 0.9472222222222223 | 0 |
| 0.9479166666666666 | 0 |
| 0.9486111111111111 | 0 |
| 0.9493055555555556 | 0 |
| 0.9500000000000001 | 0 |
| 0.9506944444444444 | 0 |
| 0.9513888888888888 | 0 |
| 0.9520833333333334 | 0 |
| 0.9527777777777778 | 0 |
| 0.9534722222222222 | 0 |
| 0.9541666666666666 | 0 |
| 0.9548611111111112 | 0 |
| 0.9555555555555556 | 0 |
| 0.9562499999999999 | 0 |
| 0.9569444444444444 | 0 |
| 0.9576388888888889 | 0 |
| 0.9583333333333334 | 0 |
| 0.9590277777777777 | 0 |
| 0.9597222222222223 | 0 |
| 0.9604166666666667 | 0 |
| 0.9611111111111111 | 0 |
| 0.9618055555555555 | 0 |
| 0.9625 | 0 |
| 0.9631944444444445 | 0 |
| 0.9638888888888889 | 0 |
| 0.9645833333333332 | 0 |
| 0.9652777777777778 | 0 |
| 0.9659722222222222 | 0 |
| 0.9666666666666667 | 0 |
| 0.967361111111111 | 0 |
| 0.9680555555555556 | 0 |
| 0.96875 | 0 |
| 0.9694444444444444 | 0 |
| 0.970138888888889 | 0 |
| 0.9708333333333333 | 0 |
| 0.9715277777777778 | 0 |
| 0.9722222222222222 | 0 |
| 0.9729166666666668 | 0 |
| 0.9736111111111111 | 0 |
| 0.9743055555555555 | 0 |
| 0.975 | 0 |
| 0.9756944444444445 | 0 |
| 0.9763888888888889 | 0 |
| 0.9770833333333333 | 0 |
| 0.9777777777777777 | 0 |
| 0.9784722222222223 | 0 |
| 0.9791666666666666 | 0 |
| 0.9798611111111111 | 0 |
| 0.9805555555555556 | 0 |
| 0.9812500000000001 | 0 |
| 0.9819444444444444 | 0 |
| 0.9826388888888888 | 0 |
| 0.9833333333333334 | 0 |
| 0.9840277777777778 | 0 |
| 0.9847222222222222 | 0 |
| 0.9854166666666666 | 0 |
| 0.9861111111111112 | 0 |
| 0.9868055555555556 | 0 |
| 0.9874999999999999 | 0 |
| 0.9881944444444444 | 0 |
| 0.9888888888888889 | 0 |
| 0.9895833333333334 | 0 |
| 0.9902777777777777 | 0 |
| 0.9909722222222223 | 0 |
| 0.9916666666666667 | 0 |
| 0.9923611111111111 | 0 |
| 0.9930555555555555 | 0 |
| 0.99375 | 0 |
| 0.9944444444444445 | 0 |
| 0.9951388888888889 | 0 |
| 0.9958333333333332 | 0 |
| 0.9965277777777778 | 0 |
| 0.9972222222222222 | 0 |
| 0.9979166666666667 | 0 |
| 0.998611111111111 | 0 |
| 0.9993055555555556 | 0 |